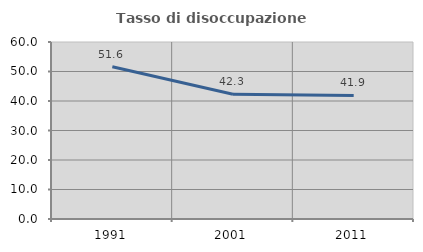
| Category | Tasso di disoccupazione giovanile  |
|---|---|
| 1991.0 | 51.603 |
| 2001.0 | 42.301 |
| 2011.0 | 41.884 |